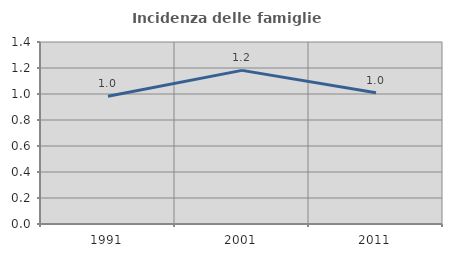
| Category | Incidenza delle famiglie numerose |
|---|---|
| 1991.0 | 0.983 |
| 2001.0 | 1.182 |
| 2011.0 | 1.009 |